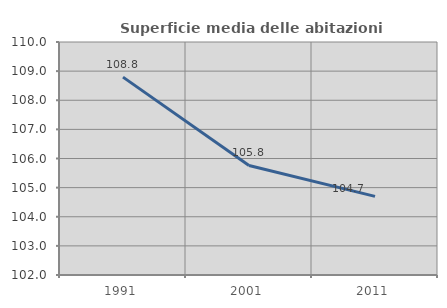
| Category | Superficie media delle abitazioni occupate |
|---|---|
| 1991.0 | 108.793 |
| 2001.0 | 105.76 |
| 2011.0 | 104.7 |